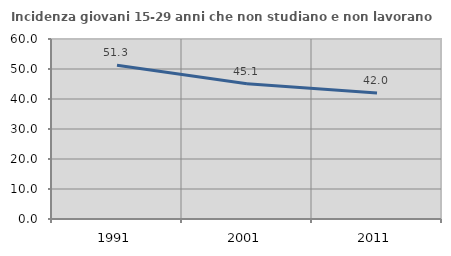
| Category | Incidenza giovani 15-29 anni che non studiano e non lavorano  |
|---|---|
| 1991.0 | 51.254 |
| 2001.0 | 45.082 |
| 2011.0 | 42.035 |